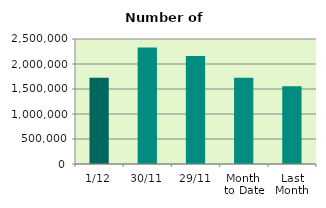
| Category | Series 0 |
|---|---|
| 1/12 | 1724046 |
| 30/11 | 2328666 |
| 29/11 | 2161608 |
| Month 
to Date | 1724046 |
| Last
Month | 1553278.182 |